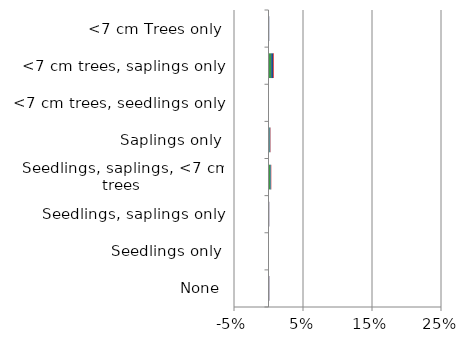
| Category | England | Scotland | Wales |
|---|---|---|---|
| None | 0.001 | 0.001 | 0 |
| Seedlings only | 0 | 0 | 0 |
| Seedlings, saplings only | 0 | 0.001 | 0 |
| Seedlings, saplings, <7 cm trees | 0.003 | 0.001 | 0 |
| Saplings only | 0.001 | 0.001 | 0 |
| <7 cm trees, seedlings only | 0 | 0 | 0 |
| <7 cm trees, saplings only | 0.004 | 0.003 | 0.001 |
| <7 cm Trees only | 0.001 | 0.001 | 0 |